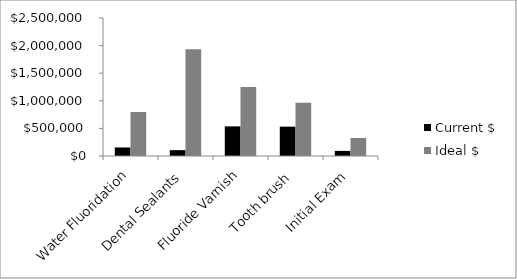
| Category | Current $ | Ideal $ |
|---|---|---|
| Water Fluoridation | 154609.926 | 797303.094 |
| Dental Sealants | 105945.119 | 1935829.219 |
| Fluoride Varnish | 536747.275 | 1252020.521 |
| Tooth brush | 531559.59 | 966471.981 |
| Initial Exam | 92559.184 | 325671.202 |